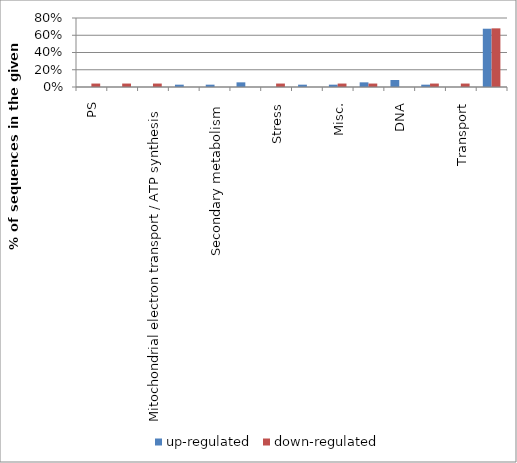
| Category | up-regulated | down-regulated |
|---|---|---|
| PS | 0 | 0.04 |
| Glycolysis | 0 | 0.04 |
| Mitochondrial electron transport / ATP synthesis | 0 | 0.04 |
| Lipid metabolism | 0.027 | 0 |
| Secondary metabolism | 0.027 | 0 |
| Hormone metabolism | 0.054 | 0 |
| Stress | 0 | 0.04 |
| Polyamine metabolism | 0.027 | 0 |
| Misc. | 0.027 | 0.04 |
| RNA | 0.054 | 0.04 |
| DNA | 0.081 | 0 |
| Protein | 0.027 | 0.04 |
| Transport | 0 | 0.04 |
| Not assigned | 0.676 | 0.68 |